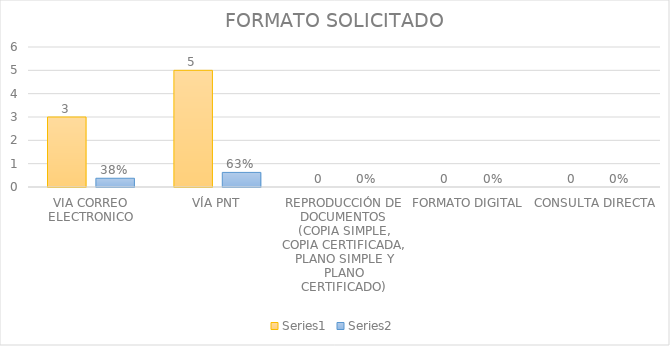
| Category | Series 3 | Series 4 |
|---|---|---|
| VIA CORREO ELECTRONICO | 3 | 0.375 |
| VÍA PNT | 5 | 0.625 |
| REPRODUCCIÓN DE DOCUMENTOS (COPIA SIMPLE, COPIA CERTIFICADA, PLANO SIMPLE Y PLANO CERTIFICADO) | 0 | 0 |
| FORMATO DIGITAL | 0 | 0 |
| CONSULTA DIRECTA | 0 | 0 |